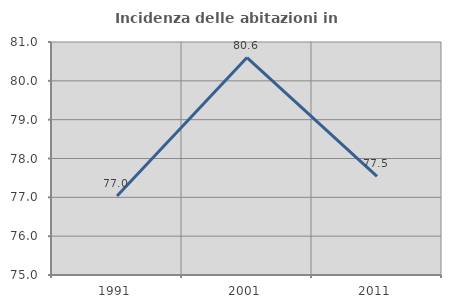
| Category | Incidenza delle abitazioni in proprietà  |
|---|---|
| 1991.0 | 77.035 |
| 2001.0 | 80.599 |
| 2011.0 | 77.541 |